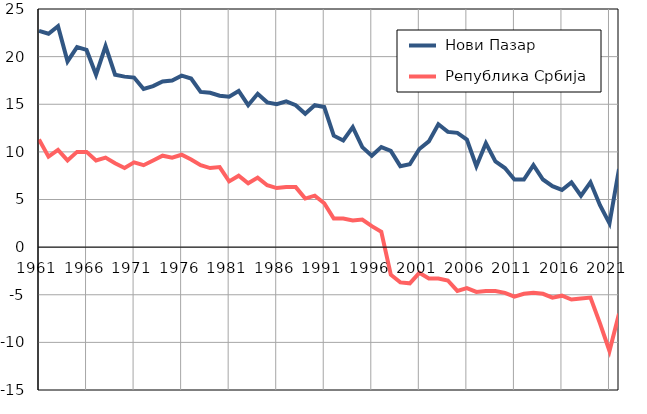
| Category |  Нови Пазар |  Република Србија |
|---|---|---|
| 1961.0 | 22.7 | 11.3 |
| 1962.0 | 22.4 | 9.5 |
| 1963.0 | 23.2 | 10.2 |
| 1964.0 | 19.5 | 9.1 |
| 1965.0 | 21 | 10 |
| 1966.0 | 20.7 | 10 |
| 1967.0 | 18.1 | 9.1 |
| 1968.0 | 21.1 | 9.4 |
| 1969.0 | 18.1 | 8.8 |
| 1970.0 | 17.9 | 8.3 |
| 1971.0 | 17.8 | 8.9 |
| 1972.0 | 16.6 | 8.6 |
| 1973.0 | 16.9 | 9.1 |
| 1974.0 | 17.4 | 9.6 |
| 1975.0 | 17.5 | 9.4 |
| 1976.0 | 18 | 9.7 |
| 1977.0 | 17.7 | 9.2 |
| 1978.0 | 16.3 | 8.6 |
| 1979.0 | 16.2 | 8.3 |
| 1980.0 | 15.9 | 8.4 |
| 1981.0 | 15.8 | 6.9 |
| 1982.0 | 16.4 | 7.5 |
| 1983.0 | 14.9 | 6.7 |
| 1984.0 | 16.1 | 7.3 |
| 1985.0 | 15.2 | 6.5 |
| 1986.0 | 15 | 6.2 |
| 1987.0 | 15.3 | 6.3 |
| 1988.0 | 14.9 | 6.3 |
| 1989.0 | 14 | 5.1 |
| 1990.0 | 14.9 | 5.4 |
| 1991.0 | 14.7 | 4.6 |
| 1992.0 | 11.7 | 3 |
| 1993.0 | 11.2 | 3 |
| 1994.0 | 12.6 | 2.8 |
| 1995.0 | 10.5 | 2.9 |
| 1996.0 | 9.6 | 2.2 |
| 1997.0 | 10.5 | 1.6 |
| 1998.0 | 10.1 | -2.9 |
| 1999.0 | 8.5 | -3.7 |
| 2000.0 | 8.7 | -3.8 |
| 2001.0 | 10.3 | -2.7 |
| 2002.0 | 11.1 | -3.3 |
| 2003.0 | 12.9 | -3.3 |
| 2004.0 | 12.1 | -3.5 |
| 2005.0 | 12 | -4.6 |
| 2006.0 | 11.3 | -4.3 |
| 2007.0 | 8.5 | -4.7 |
| 2008.0 | 10.9 | -4.6 |
| 2009.0 | 9 | -4.6 |
| 2010.0 | 8.3 | -4.8 |
| 2011.0 | 7.1 | -5.2 |
| 2012.0 | 7.1 | -4.9 |
| 2013.0 | 8.6 | -4.8 |
| 2014.0 | 7.1 | -4.9 |
| 2015.0 | 6.4 | -5.3 |
| 2016.0 | 6 | -5.1 |
| 2017.0 | 6.8 | -5.5 |
| 2018.0 | 5.4 | -5.4 |
| 2019.0 | 6.8 | -5.3 |
| 2020.0 | 4.4 | -8 |
| 2021.0 | 2.5 | -10.9 |
| 2022.0 | 8.2 | -7 |